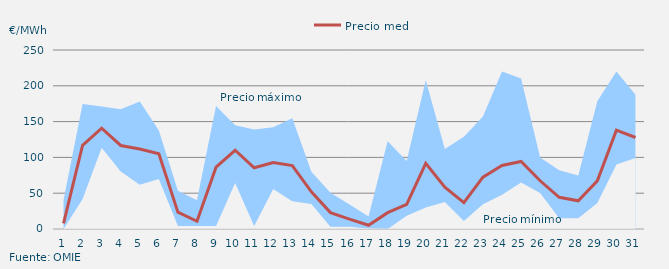
| Category | Precio medio |
|---|---|
| 1.0 | 7.896 |
| 2.0 | 116.946 |
| 3.0 | 140.77 |
| 4.0 | 116.644 |
| 5.0 | 111.787 |
| 6.0 | 105.199 |
| 7.0 | 23.546 |
| 8.0 | 10.767 |
| 9.0 | 86.344 |
| 10.0 | 109.975 |
| 11.0 | 85.503 |
| 12.0 | 92.95 |
| 13.0 | 88.676 |
| 14.0 | 51.9 |
| 15.0 | 22.872 |
| 16.0 | 13.77 |
| 17.0 | 5.205 |
| 18.0 | 22.777 |
| 19.0 | 34.53 |
| 20.0 | 91.602 |
| 21.0 | 58.47 |
| 22.0 | 36.894 |
| 23.0 | 72.335 |
| 24.0 | 88.741 |
| 25.0 | 94.269 |
| 26.0 | 67.373 |
| 27.0 | 44.246 |
| 28.0 | 39.333 |
| 29.0 | 67.295 |
| 30.0 | 138.021 |
| 31.0 | 127.779 |